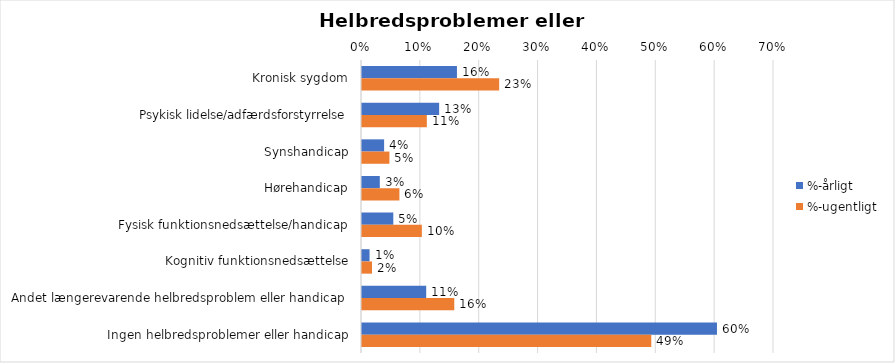
| Category | %-årligt | %-ugentligt |
|---|---|---|
| Kronisk sygdom | 0.161 | 0.233 |
| Psykisk lidelse/adfærdsforstyrrelse | 0.131 | 0.11 |
| Synshandicap | 0.038 | 0.047 |
| Hørehandicap | 0.03 | 0.064 |
| Fysisk funktionsnedsættelse/handicap | 0.053 | 0.102 |
| Kognitiv funktionsnedsættelse | 0.013 | 0.017 |
| Andet længerevarende helbredsproblem eller handicap  | 0.109 | 0.157 |
| Ingen helbredsproblemer eller handicap | 0.603 | 0.492 |